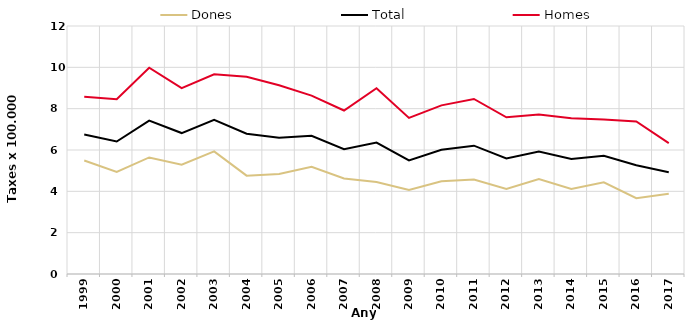
| Category | Dones | Total | Homes |
|---|---|---|---|
| 1999.0 | 5.49 | 6.75 | 8.58 |
| 2000.0 | 4.94 | 6.41 | 8.46 |
| 2001.0 | 5.64 | 7.42 | 9.98 |
| 2002.0 | 5.29 | 6.82 | 8.99 |
| 2003.0 | 5.93 | 7.46 | 9.66 |
| 2004.0 | 4.76 | 6.79 | 9.54 |
| 2005.0 | 4.84 | 6.59 | 9.13 |
| 2006.0 | 5.19 | 6.69 | 8.63 |
| 2007.0 | 4.62 | 6.04 | 7.91 |
| 2008.0 | 4.45 | 6.36 | 8.99 |
| 2009.0 | 4.07 | 5.5 | 7.55 |
| 2010.0 | 4.49 | 6.01 | 8.16 |
| 2011.0 | 4.57 | 6.21 | 8.47 |
| 2012.0 | 4.12 | 5.59 | 7.58 |
| 2013.0 | 4.6 | 5.93 | 7.72 |
| 2014.0 | 4.11 | 5.57 | 7.54 |
| 2015.0 | 4.44 | 5.72 | 7.48 |
| 2016.0 | 3.67 | 5.26 | 7.38 |
| 2017.0 | 3.88 | 4.92 | 6.33 |